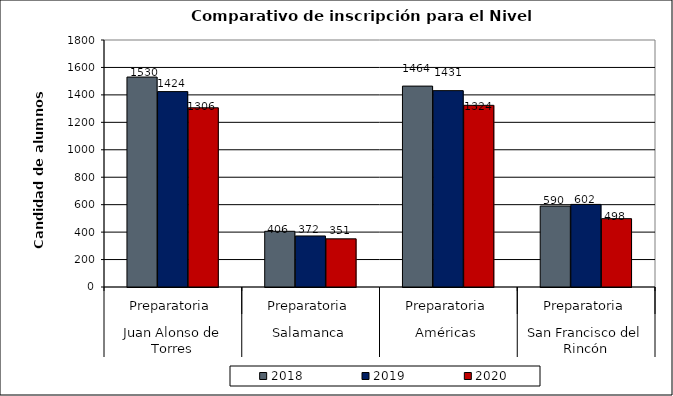
| Category | 2018 | 2019 | 2020 |
|---|---|---|---|
| 0 | 1530 | 1424 | 1306 |
| 1 | 406 | 372 | 351 |
| 2 | 1464 | 1431 | 1324 |
| 3 | 590 | 602 | 498 |